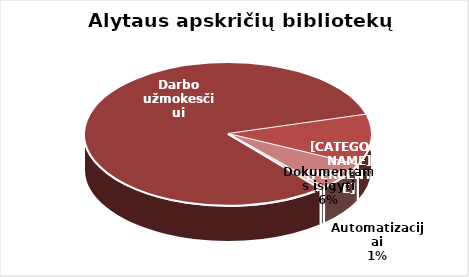
| Category | Series 0 |
|---|---|
| Darbo užmokesčiui | 2245178.71 |
| Kitos | 314272.15 |
| Dokumentams įsigyti | 171932.89 |
| Automatizacijai | 14191.33 |